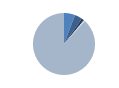
| Category | Series 0 |
|---|---|
| 0 | 56 |
| 1 | 38 |
| 2 | 14 |
| 3 | 6 |
| 4 | 856 |